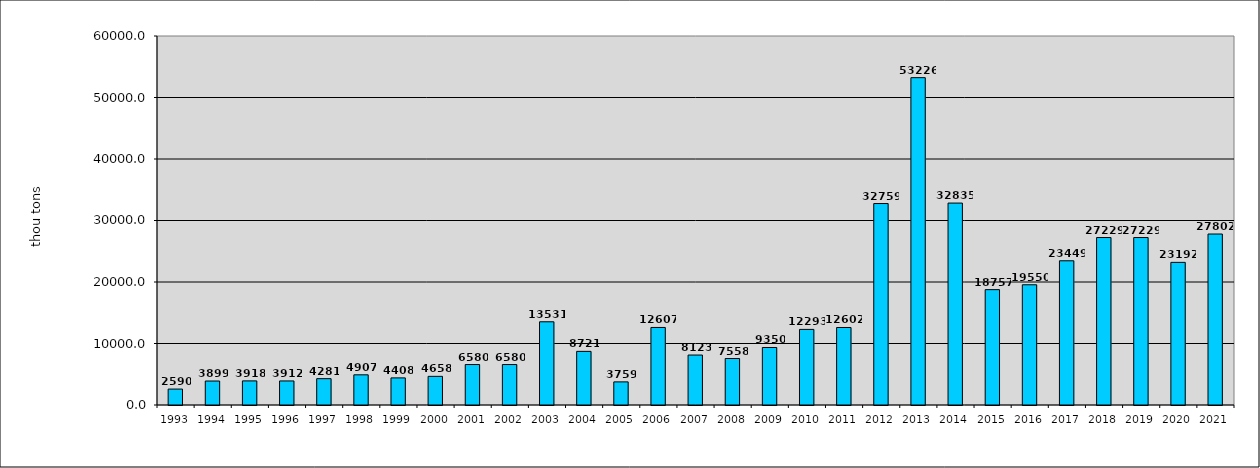
| Category | Series 0 |
|---|---|
| 1993.0 | 2590 |
| 1994.0 | 3899 |
| 1995.0 | 3918 |
| 1996.0 | 3912 |
| 1997.0 | 4281 |
| 1998.0 | 4907 |
| 1999.0 | 4408 |
| 2000.0 | 4658 |
| 2001.0 | 6580 |
| 2002.0 | 6580 |
| 2003.0 | 13531 |
| 2004.0 | 8721 |
| 2005.0 | 3759 |
| 2006.0 | 12607 |
| 2007.0 | 8123 |
| 2008.0 | 7558 |
| 2009.0 | 9350 |
| 2010.0 | 12293 |
| 2011.0 | 12602 |
| 2012.0 | 32759 |
| 2013.0 | 53226 |
| 2014.0 | 32835 |
| 2015.0 | 18757 |
| 2016.0 | 19550 |
| 2017.0 | 23449 |
| 2018.0 | 27229 |
| 2019.0 | 27229 |
| 2020.0 | 23192 |
| 2021.0 | 27802 |